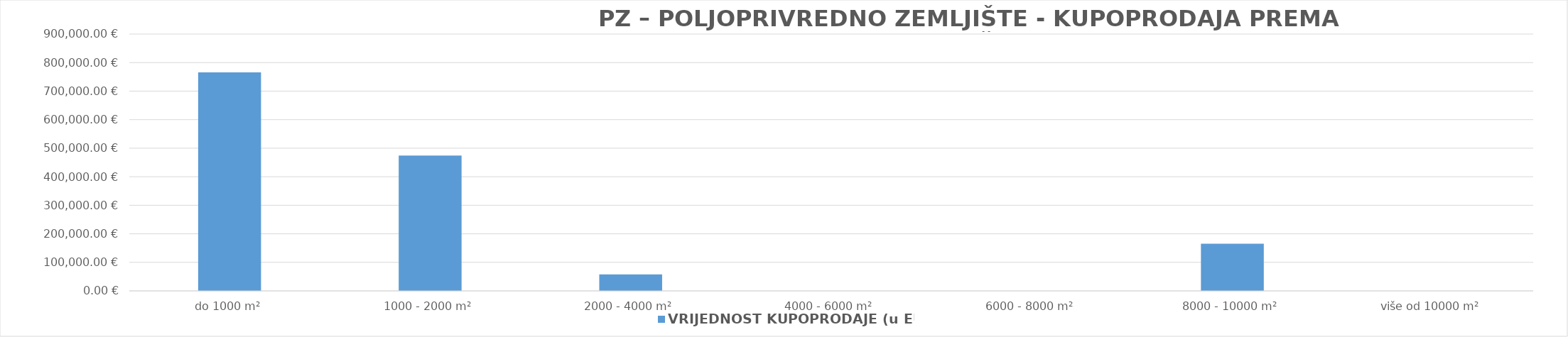
| Category | VRIJEDNOST KUPOPRODAJE (u EUR) |
|---|---|
| do 1000 m² | 765569.999 |
| 1000 - 2000 m² | 474113.832 |
| 2000 - 4000 m² | 57500 |
| 4000 - 6000 m² | 0 |
| 6000 - 8000 m² | 0 |
| 8000 - 10000 m² | 165480.881 |
| više od 10000 m² | 0 |